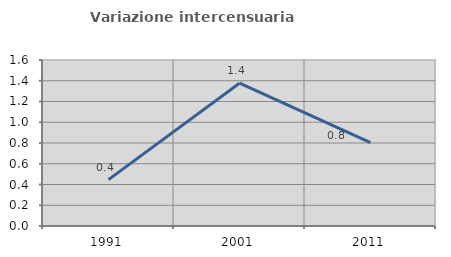
| Category | Variazione intercensuaria annua |
|---|---|
| 1991.0 | 0.447 |
| 2001.0 | 1.376 |
| 2011.0 | 0.803 |